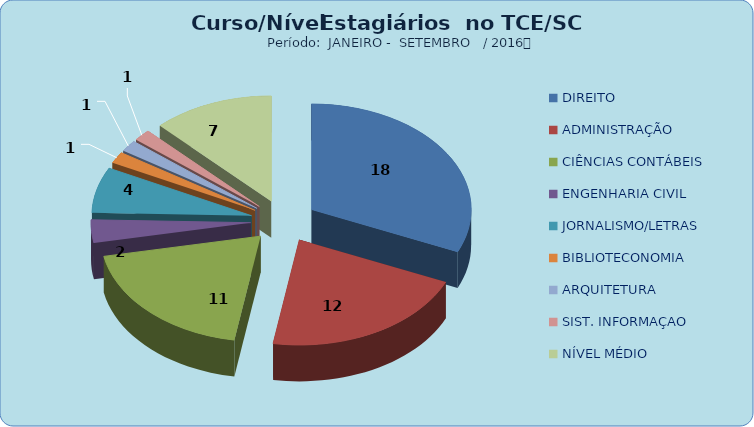
| Category | Series 0 |
|---|---|
| DIREITO | 18 |
| ADMINISTRAÇÃO | 12 |
| CIÊNCIAS CONTÁBEIS | 11 |
| ENGENHARIA CIVIL | 2 |
| JORNALISMO/LETRAS | 4 |
| BIBLIOTECONOMIA | 1 |
| ARQUITETURA | 1 |
| SIST. INFORMAÇAO | 1 |
| NÍVEL MÉDIO | 7 |